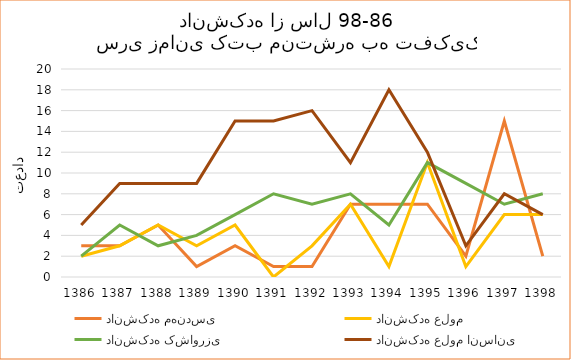
| Category | دانشکده مهندسی | دانشکده علوم | دانشکده کشاورزی | دانشکده علوم انسانی |
|---|---|---|---|---|
| 1386.0 | 3 | 2 | 2 | 5 |
| 1387.0 | 3 | 3 | 5 | 9 |
| 1388.0 | 5 | 5 | 3 | 9 |
| 1389.0 | 1 | 3 | 4 | 9 |
| 1390.0 | 3 | 5 | 6 | 15 |
| 1391.0 | 1 | 0 | 8 | 15 |
| 1392.0 | 1 | 3 | 7 | 16 |
| 1393.0 | 7 | 7 | 8 | 11 |
| 1394.0 | 7 | 1 | 5 | 18 |
| 1395.0 | 7 | 11 | 11 | 12 |
| 1396.0 | 2 | 1 | 9 | 3 |
| 1397.0 | 15 | 6 | 7 | 8 |
| 1398.0 | 2 | 6 | 8 | 6 |